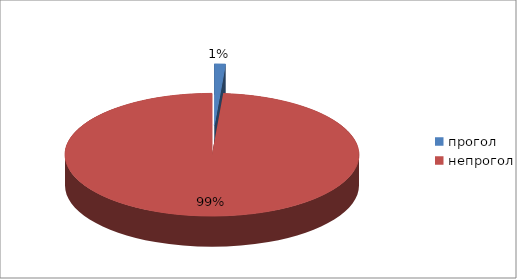
| Category | Series 0 |
|---|---|
| прогол | 10 |
| непрогол | 815 |